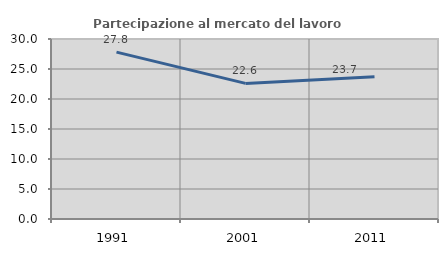
| Category | Partecipazione al mercato del lavoro  femminile |
|---|---|
| 1991.0 | 27.817 |
| 2001.0 | 22.597 |
| 2011.0 | 23.727 |